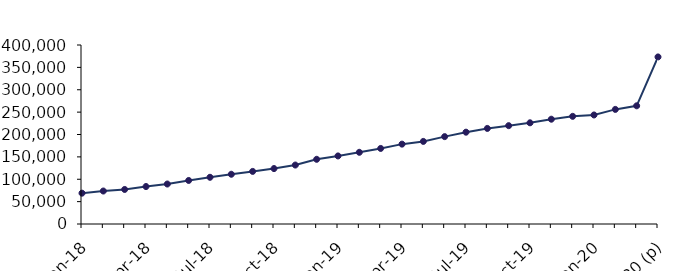
| Category | Series 1 |
|---|---|
| Jan-18 | 68902 |
| Feb-18 | 73690 |
| Mar-18 | 77192 |
| Apr-18 | 83705 |
| May-18 | 89326 |
| Jun-18 | 97277 |
| Jul-18 | 104398 |
| Aug-18 | 111144 |
| Sep-18 | 117525 |
| Oct-18 | 123852 |
| Nov-18 | 131763 |
| Dec-18 | 144557 |
| Jan-19 | 152087 |
| Feb-19 | 160208 |
| Mar-19 | 168849 |
| Apr-19 | 178459 |
| May-19 | 184537 |
| Jun-19 | 195266 |
| Jul-19 | 205187 |
| Aug-19 | 213557 |
| Sep-19 | 219744 |
| Oct-19 | 226122 |
| Nov-19 | 234154 |
| Dec-19 | 240589 |
| Jan-20 | 243641 |
| Feb-20 | 256083 |
| Mar-20 | 264117 |
| Apr-20 (p) | 373306 |